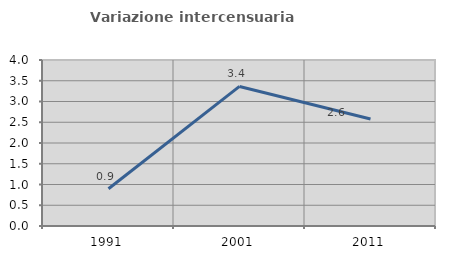
| Category | Variazione intercensuaria annua |
|---|---|
| 1991.0 | 0.897 |
| 2001.0 | 3.363 |
| 2011.0 | 2.577 |